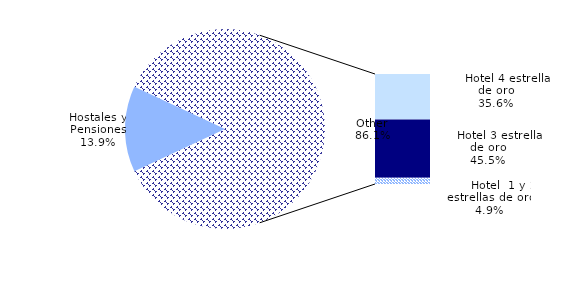
| Category | Pernoctaciones |
|---|---|
| Hostales y Pensiones | 138953 |
|       Hotel 4 estrellas de oro | 356241 |
|       Hotel 3 estrellas de oro | 455151 |
|       Hotel  1 y 2 estrellas de oro | 49405 |